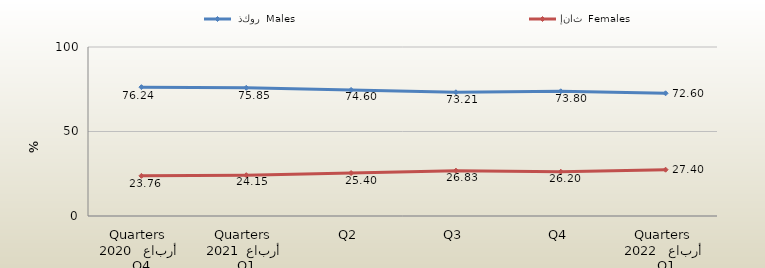
| Category |  ذكور  Males | إناث  Females |
|---|---|---|
| 0 | 76.241 | 23.759 |
| 1 | 75.852 | 24.148 |
| 2 | 74.599 | 25.401 |
| 3 | 73.206 | 26.833 |
| 4 | 73.8 | 26.2 |
| 5 | 72.6 | 27.4 |